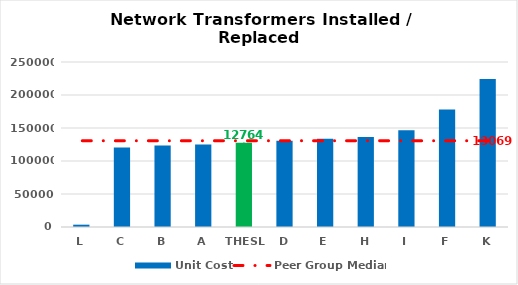
| Category | Unit Cost |
|---|---|
| L | 3513.3 |
| C | 120482.172 |
| B | 123431.796 |
| A | 125053.578 |
| THESL | 127649 |
| D | 130689.558 |
| E | 133553.556 |
| H | 136293.281 |
| I | 146596.837 |
| F | 178119.76 |
| K | 224400 |